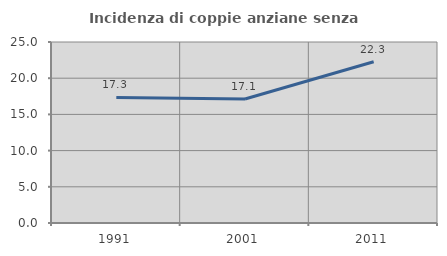
| Category | Incidenza di coppie anziane senza figli  |
|---|---|
| 1991.0 | 17.341 |
| 2001.0 | 17.127 |
| 2011.0 | 22.28 |